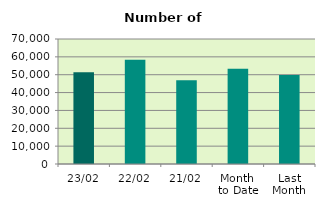
| Category | Series 0 |
|---|---|
| 23/02 | 51366 |
| 22/02 | 58344 |
| 21/02 | 46904 |
| Month 
to Date | 53390.706 |
| Last
Month | 49894.952 |